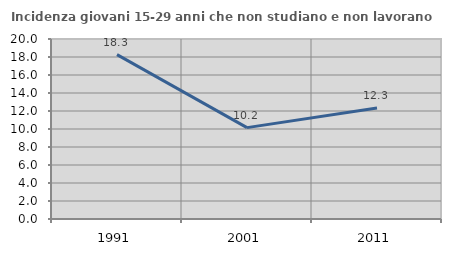
| Category | Incidenza giovani 15-29 anni che non studiano e non lavorano  |
|---|---|
| 1991.0 | 18.261 |
| 2001.0 | 10.152 |
| 2011.0 | 12.344 |